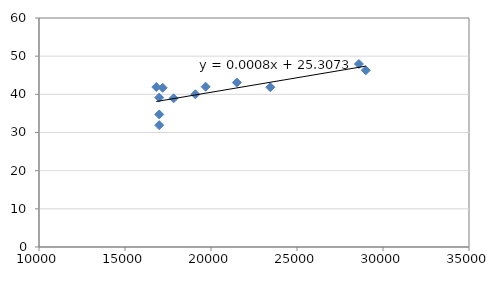
| Category | Series 0 |
|---|---|
| 16990.0 | 31.92 |
| 16990.0 | 34.73 |
| 16990.0 | 39.15 |
| 17825.0 | 38.95 |
| 19090.0 | 40 |
| 16820.0 | 41.91 |
| 17190.0 | 41.72 |
| 19690.0 | 42 |
| 23450.0 | 41.86 |
| 21500.0 | 43.09 |
| 28600.0 | 47.95 |
| 29000.0 | 46.31 |